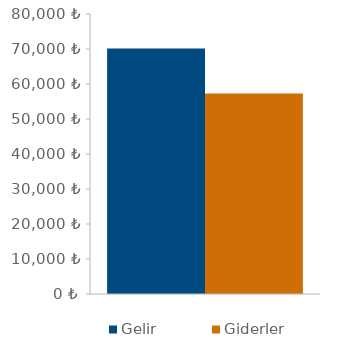
| Category | Gelir | Giderler |
|---|---|---|
| 0 | 70128 | 57288.89 |